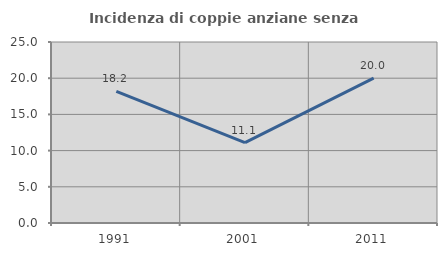
| Category | Incidenza di coppie anziane senza figli  |
|---|---|
| 1991.0 | 18.182 |
| 2001.0 | 11.111 |
| 2011.0 | 20 |